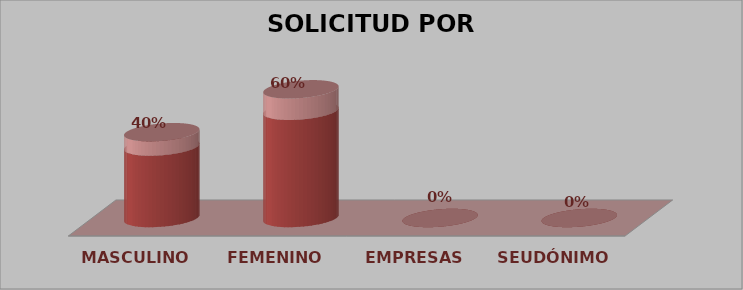
| Category | SOLICITUD POR GÉNERO | Series 1 |
|---|---|---|
| MASCULINO | 2 | 0.4 |
| FEMENINO | 3 | 0.6 |
| EMPRESAS | 0 | 0 |
| SEUDÓNIMO | 0 | 0 |